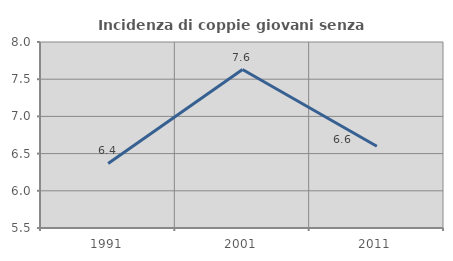
| Category | Incidenza di coppie giovani senza figli |
|---|---|
| 1991.0 | 6.367 |
| 2001.0 | 7.629 |
| 2011.0 | 6.598 |